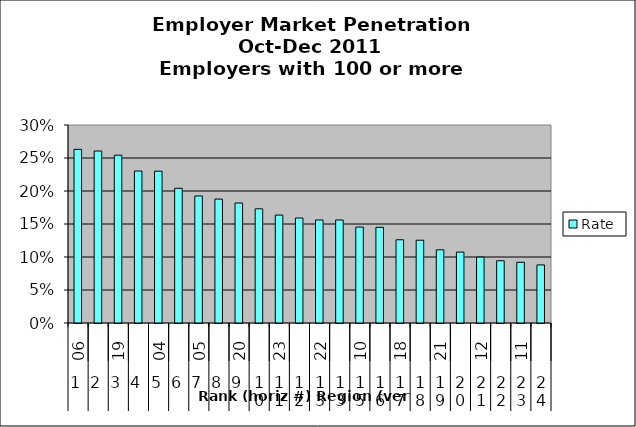
| Category | Rate |
|---|---|
| 0 | 0.263 |
| 1 | 0.261 |
| 2 | 0.254 |
| 3 | 0.23 |
| 4 | 0.23 |
| 5 | 0.204 |
| 6 | 0.192 |
| 7 | 0.188 |
| 8 | 0.182 |
| 9 | 0.173 |
| 10 | 0.163 |
| 11 | 0.159 |
| 12 | 0.156 |
| 13 | 0.156 |
| 14 | 0.145 |
| 15 | 0.145 |
| 16 | 0.126 |
| 17 | 0.125 |
| 18 | 0.111 |
| 19 | 0.107 |
| 20 | 0.1 |
| 21 | 0.094 |
| 22 | 0.092 |
| 23 | 0.088 |